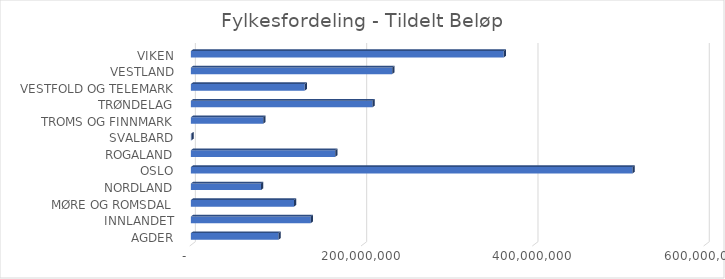
| Category | Tildelt Beløp |
|---|---|
|  AGDER  | 102309189.2 |
|  INNLANDET  | 139997907.5 |
|  MØRE OG ROMSDAL  | 120406502.8 |
|  NORDLAND  | 81842840.2 |
|  OSLO  | 515614517.5 |
|  ROGALAND  | 168433909.3 |
|  SVALBARD  | 609158 |
|  TROMS OG FINNMARK  | 84391446.5 |
|  TRØNDELAG  | 212117670.9 |
|  VESTFOLD OG TELEMARK  | 132876919.8 |
|  VESTLAND  | 234993079.6 |
|  VIKEN  | 365211215.7 |